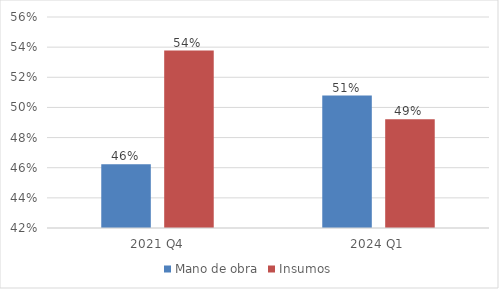
| Category | Mano de obra | Insumos |
|---|---|---|
| 2021 Q4 | 0.462 | 0.538 |
| 2024 Q1 | 0.508 | 0.492 |